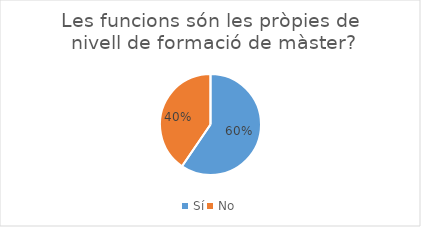
| Category | Series 0 |
|---|---|
| Sí | 50 |
| No | 34 |